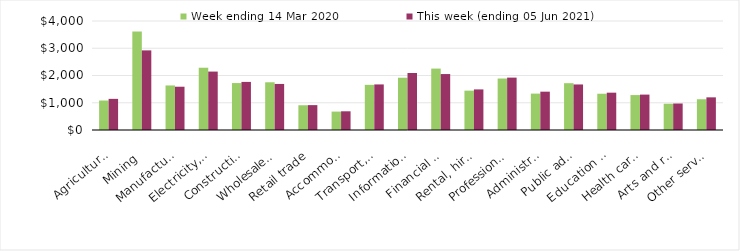
| Category | Week ending 14 Mar 2020 | This week (ending 05 Jun 2021) |
|---|---|---|
| Agriculture, forestry and fishing | 1081.52 | 1142.72 |
| Mining | 3610.88 | 2921.65 |
| Manufacturing | 1634.9 | 1588.25 |
| Electricity, gas, water and waste services | 2285.17 | 2143.96 |
| Construction | 1723.07 | 1764.83 |
| Wholesale trade | 1750.86 | 1689.83 |
| Retail trade | 908.77 | 913.02 |
| Accommodation and food services | 675.69 | 686.54 |
| Transport, postal and warehousing | 1657.25 | 1672.4 |
| Information media and telecommunications | 1918.47 | 2092.6 |
| Financial and insurance services | 2253.66 | 2053.04 |
| Rental, hiring and real estate services | 1444.21 | 1489.71 |
| Professional, scientific and technical services | 1888.76 | 1922.36 |
| Administrative and support services | 1335.61 | 1406.68 |
| Public administration and safety | 1717.65 | 1671.49 |
| Education and training | 1330.73 | 1369.78 |
| Health care and social assistance | 1281.9 | 1299.2 |
| Arts and recreation services | 964.04 | 972.54 |
| Other services | 1128.84 | 1198.13 |